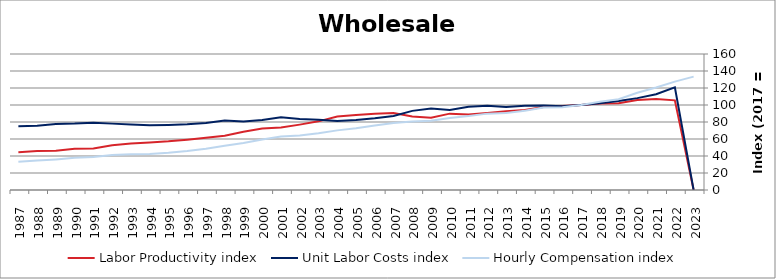
| Category | Labor Productivity index | Unit Labor Costs index | Hourly Compensation index |
|---|---|---|---|
| 2023.0 | 0 | 0 | 133.387 |
| 2022.0 | 105.475 | 120.871 | 127.489 |
| 2021.0 | 107.117 | 112.587 | 120.6 |
| 2020.0 | 105.767 | 108.099 | 114.334 |
| 2019.0 | 102.003 | 104.67 | 106.766 |
| 2018.0 | 101.842 | 101.949 | 103.827 |
| 2017.0 | 100 | 100 | 100 |
| 2016.0 | 98.782 | 98.523 | 97.323 |
| 2015.0 | 97.669 | 99.343 | 97.028 |
| 2014.0 | 94.003 | 99.133 | 93.188 |
| 2013.0 | 92.606 | 97.757 | 90.529 |
| 2012.0 | 90.541 | 99.238 | 89.851 |
| 2011.0 | 88.891 | 97.813 | 86.947 |
| 2010.0 | 89.837 | 94.143 | 84.576 |
| 2009.0 | 84.941 | 95.96 | 81.509 |
| 2008.0 | 86.553 | 93.101 | 80.581 |
| 2007.0 | 90.554 | 87.084 | 78.858 |
| 2006.0 | 89.847 | 84.509 | 75.928 |
| 2005.0 | 88.285 | 82.431 | 72.774 |
| 2004.0 | 86.379 | 81.205 | 70.144 |
| 2003.0 | 80.755 | 82.681 | 66.769 |
| 2002.0 | 76.913 | 83.49 | 64.215 |
| 2001.0 | 73.504 | 85.489 | 62.838 |
| 2000.0 | 72.371 | 82.237 | 59.516 |
| 1999.0 | 68.615 | 80.657 | 55.343 |
| 1998.0 | 63.739 | 81.789 | 52.131 |
| 1997.0 | 61.466 | 78.803 | 48.437 |
| 1996.0 | 59.212 | 77.337 | 45.793 |
| 1995.0 | 57.227 | 76.572 | 43.82 |
| 1994.0 | 55.741 | 76.206 | 42.478 |
| 1993.0 | 54.657 | 77.186 | 42.187 |
| 1992.0 | 52.767 | 78.088 | 41.204 |
| 1991.0 | 48.933 | 79.113 | 38.712 |
| 1990.0 | 48.499 | 78.166 | 37.91 |
| 1989.0 | 46.296 | 77.779 | 36.008 |
| 1988.0 | 45.775 | 75.531 | 34.574 |
| 1987.0 | 44.352 | 75.013 | 33.27 |